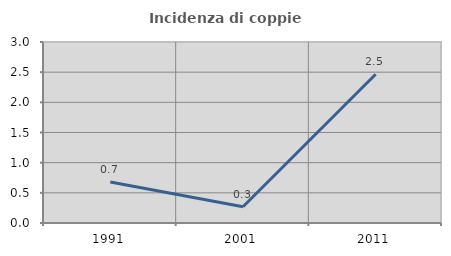
| Category | Incidenza di coppie miste |
|---|---|
| 1991.0 | 0.68 |
| 2001.0 | 0.27 |
| 2011.0 | 2.466 |